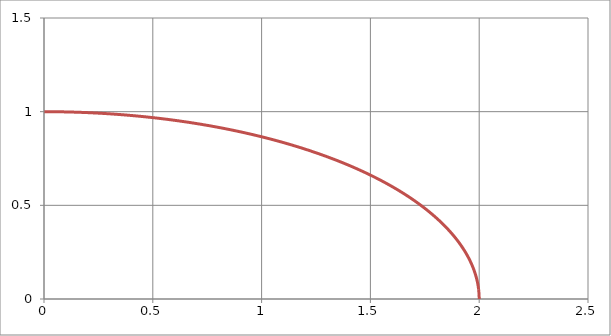
| Category | Series 1 |
|---|---|
| 2.0 | 0 |
| 1.9993146499511145 | 0.026 |
| 1.9972590695091477 | 0.052 |
| 1.993834667466256 | 0.078 |
| 1.9890437907365466 | 0.105 |
| 1.9828897227476208 | 0.131 |
| 1.9753766811902755 | 0.156 |
| 1.9665098151279092 | 0.182 |
| 1.9562952014676114 | 0.208 |
| 1.9447398407953531 | 0.233 |
| 1.9318516525781366 | 0.259 |
| 1.917639469736386 | 0.284 |
| 1.902113032590307 | 0.309 |
| 1.8852829821843569 | 0.334 |
| 1.8671608529944035 | 0.358 |
| 1.8477590650225735 | 0.383 |
| 1.8270909152852017 | 0.407 |
| 1.8051705686997213 | 0.431 |
| 1.7820130483767358 | 0.454 |
| 1.7576342253239308 | 0.477 |
| 1.7320508075688774 | 0.5 |
| 1.7052803287081844 | 0.522 |
| 1.677341135890848 | 0.545 |
| 1.6482523772440314 | 0.566 |
| 1.618033988749895 | 0.588 |
| 1.5867066805824703 | 0.609 |
| 1.5542919229139418 | 0.629 |
| 1.5208119312000619 | 0.649 |
| 1.4862896509547885 | 0.669 |
| 1.4507487420245753 | 0.688 |
| 1.4142135623730951 | 0.707 |
| 1.376709151387508 | 0.725 |
| 1.3382612127177165 | 0.743 |
| 1.2988960966603673 | 0.76 |
| 1.258640782099675 | 0.777 |
| 1.2175228580174413 | 0.793 |
| 1.1755705045849463 | 0.809 |
| 1.1328124738496657 | 0.824 |
| 1.0892780700300542 | 0.839 |
| 1.0449971294318978 | 0.853 |
| 1.0000000000000002 | 0.866 |
| 0.9543175205192168 | 0.879 |
| 0.9079809994790936 | 0.891 |
| 0.8610221936165905 | 0.903 |
| 0.8134732861516004 | 0.914 |
| 0.7653668647301797 | 0.924 |
| 0.7167358990906008 | 0.934 |
| 0.6676137184675418 | 0.943 |
| 0.6180339887498949 | 0.951 |
| 0.5680306894078455 | 0.959 |
| 0.5176380902050415 | 0.966 |
| 0.46689072771181095 | 0.972 |
| 0.4158233816355189 | 0.978 |
| 0.3644710509842949 | 0.983 |
| 0.31286893008046185 | 0.988 |
| 0.2610523844401034 | 0.991 |
| 0.20905692653530691 | 0.995 |
| 0.15691819145569 | 0.997 |
| 0.10467191248588793 | 0.999 |
| 0.05235389661574628 | 1 |
| 1.22514845490862e-16 | 1 |